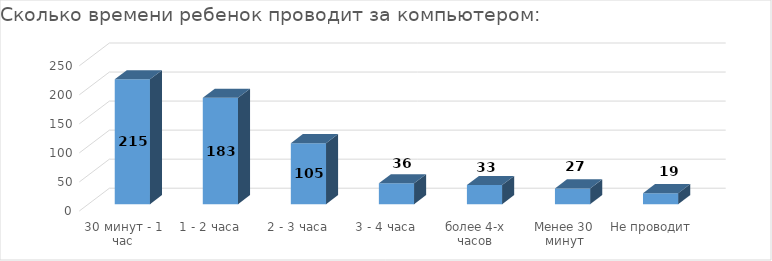
| Category | Series 0 |
|---|---|
| 30 минут - 1 час | 215 |
| 1 - 2 часа | 183 |
| 2 - 3 часа | 105 |
| 3 - 4 часа | 36 |
| более 4-х часов | 33 |
| Менее 30 минут | 27 |
| Не проводит | 19 |